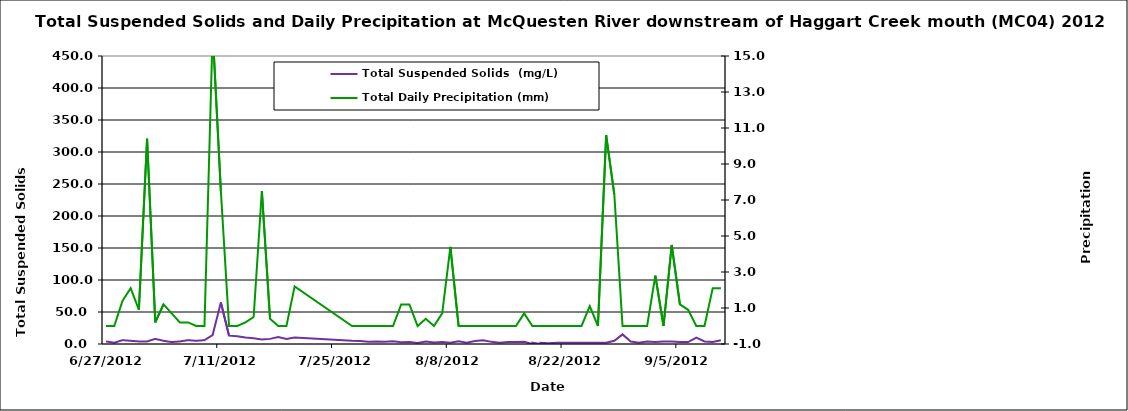
| Category | Total Suspended Solids  (mg/L) |
|---|---|
| 6/27/12 | 4 |
| 6/28/12 | 2 |
| 6/29/12 | 6 |
| 6/30/12 | 5 |
| 7/1/12 | 4 |
| 7/2/12 | 4 |
| 7/3/12 | 8 |
| 7/4/12 | 5 |
| 7/5/12 | 3 |
| 7/6/12 | 4 |
| 7/7/12 | 6 |
| 7/8/12 | 5 |
| 7/9/12 | 6 |
| 7/10/12 | 14 |
| 7/11/12 | 65 |
| 7/12/12 | 13 |
| 7/13/12 | 12 |
| 7/14/12 | 10 |
| 7/15/12 | 9 |
| 7/16/12 | 7 |
| 7/17/12 | 8 |
| 7/18/12 | 11 |
| 7/19/12 | 8 |
| 7/20/12 | 10 |
| 7/27/12 | 5.2 |
| 7/28/12 | 4.8 |
| 7/29/12 | 3.333 |
| 7/30/12 | 4 |
| 7/31/12 | 3.667 |
| 8/1/12 | 4.4 |
| 8/2/12 | 2.8 |
| 8/3/12 | 3.2 |
| 8/4/12 | 1.667 |
| 8/5/12 | 4 |
| 8/6/12 | 2.4 |
| 8/7/12 | 3 |
| 8/8/12 | 2 |
| 8/9/12 | 4.333 |
| 8/10/12 | 2 |
| 8/11/12 | 4.8 |
| 8/12/12 | 6 |
| 8/13/12 | 3.333 |
| 8/14/12 | 2 |
| 8/15/12 | 3.2 |
| 8/16/12 | 3 |
| 8/17/12 | 3.333 |
| 8/18/12 | 0 |
| 8/18/12 | 2 |
| 8/19/12 | 0 |
| 8/19/12 | 2 |
| 8/20/12 | 1 |
| 8/21/12 | 2 |
| 8/22/12 | 2 |
| 8/23/12 | 2 |
| 8/24/12 | 2 |
| 8/25/12 | 2 |
| 8/26/12 | 2 |
| 8/27/12 | 2 |
| 8/28/12 | 5 |
| 8/29/12 | 15 |
| 8/30/12 | 4 |
| 8/31/12 | 2 |
| 9/1/12 | 4 |
| 9/2/12 | 3 |
| 9/3/12 | 4 |
| 9/4/12 | 4 |
| 9/5/12 | 3 |
| 9/6/12 | 3 |
| 9/7/12 | 10 |
| 9/8/12 | 4 |
| 9/9/12 | 3 |
| 9/10/12 | 6 |